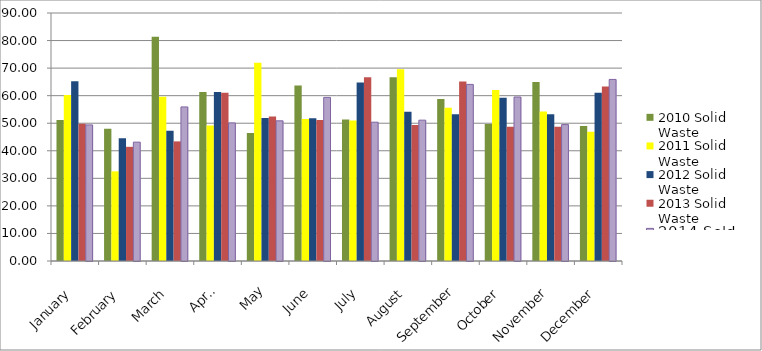
| Category | 2010 Solid Waste | 2011 Solid Waste | 2012 Solid Waste | 2013 Solid Waste | 2014 Sold Waste  |
|---|---|---|---|---|---|
| January | 51.13 | 60.2 | 65.24 | 49.81 | 49.39 |
| February | 48.03 | 32.54 | 44.54 | 41.43 | 43.13 |
| March | 81.34 | 59.6 | 47.28 | 43.41 | 55.92 |
| April | 61.35 | 49.21 | 61.31 | 61.07 | 50.11 |
| May | 46.41 | 71.91 | 51.92 | 52.45 | 50.87 |
| June | 63.66 | 51.57 | 51.83 | 51.15 | 59.38 |
| July | 51.38 | 51.03 | 64.76 | 66.68 | 50.37 |
| August | 66.64 | 69.58 | 54.17 | 49.35 | 51.11 |
| September | 58.76 | 55.58 | 53.25 | 65.11 | 64.09 |
| October | 49.68 | 62.06 | 59.21 | 48.71 | 59.52 |
| November | 64.97 | 54.24 | 53.25 | 48.74 | 49.5 |
| December | 48.96 | 46.86 | 61.09 | 63.37 | 65.89 |